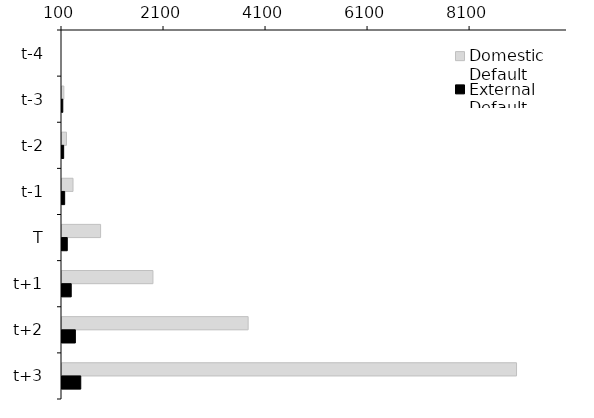
| Category | Domestic Default | External Default |
|---|---|---|
| 0 | 100 | 100 |
| 1 | 135.918 | 115.563 |
| 2 | 187.964 | 132.48 |
| 3 | 315.746 | 152.368 |
| 4 | 856.359 | 203.254 |
| 5 | 1882.516 | 280.93 |
| 6 | 3749.144 | 362.199 |
| 7 | 9010.606 | 467.623 |